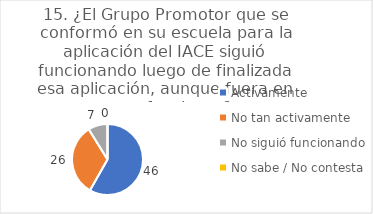
| Category | 15. ¿El Grupo Promotor que se conformó en su escuela para la aplicación del IACE siguió funcionando luego de finalizada esa aplicación, aunque fuera en otras funciones? |
|---|---|
| Activamente  | 0.582 |
| No tan activamente  | 0.329 |
| No siguió funcionando  | 0.089 |
| No sabe / No contesta | 0 |